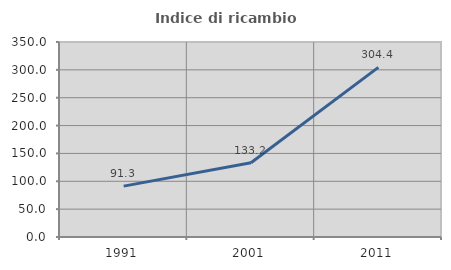
| Category | Indice di ricambio occupazionale  |
|---|---|
| 1991.0 | 91.337 |
| 2001.0 | 133.249 |
| 2011.0 | 304.428 |